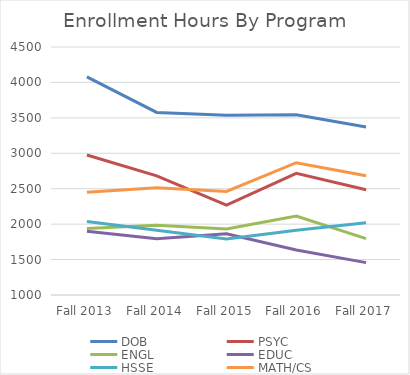
| Category | DOB | PSYC | ENGL | EDUC | HSSE | MATH/CS |
|---|---|---|---|---|---|---|
| Fall 2013 | 4078 | 2976 | 1938 | 1899 | 2037 | 2449 |
| Fall 2014 | 3577 | 2681 | 1985 | 1793 | 1913 | 2514 |
| Fall 2015 | 3538 | 2270 | 1933 | 1863 | 1789 | 2462 |
| Fall 2016 | 3543 | 2716 | 2115 | 1635 | 1913 | 2867 |
| Fall 2017 | 3371 | 2485 | 1796 | 1457 | 2021 | 2682 |